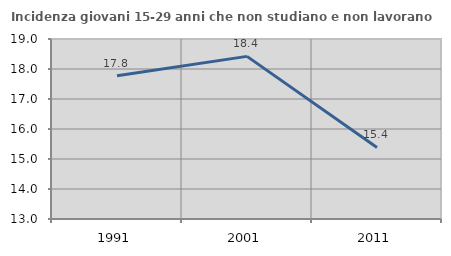
| Category | Incidenza giovani 15-29 anni che non studiano e non lavorano  |
|---|---|
| 1991.0 | 17.778 |
| 2001.0 | 18.421 |
| 2011.0 | 15.385 |